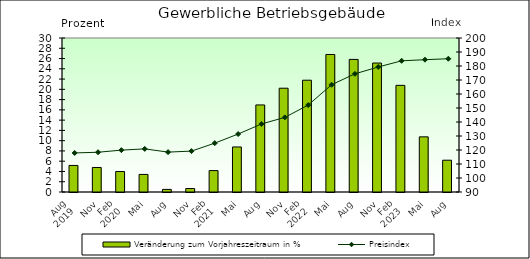
| Category | Veränderung zum Vorjahreszeitraum in % |
|---|---|
| 0 | 5.174 |
| 1 | 4.779 |
| 2 | 3.99 |
| 3 | 3.425 |
| 4 | 0.509 |
| 5 | 0.676 |
| 6 | 4.17 |
| 7 | 8.775 |
| 8 | 16.962 |
| 9 | 20.218 |
| 10 | 21.777 |
| 11 | 26.788 |
| 12 | 25.83 |
| 13 | 25.122 |
| 14 | 20.776 |
| 15 | 10.744 |
| 16 | 6.193 |